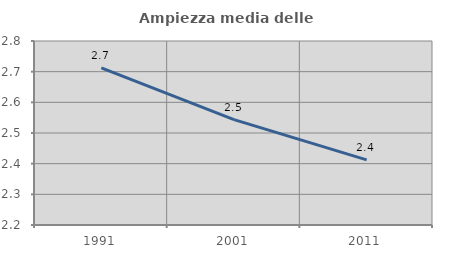
| Category | Ampiezza media delle famiglie |
|---|---|
| 1991.0 | 2.712 |
| 2001.0 | 2.544 |
| 2011.0 | 2.412 |